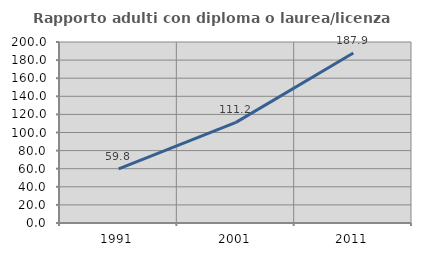
| Category | Rapporto adulti con diploma o laurea/licenza media  |
|---|---|
| 1991.0 | 59.817 |
| 2001.0 | 111.232 |
| 2011.0 | 187.903 |